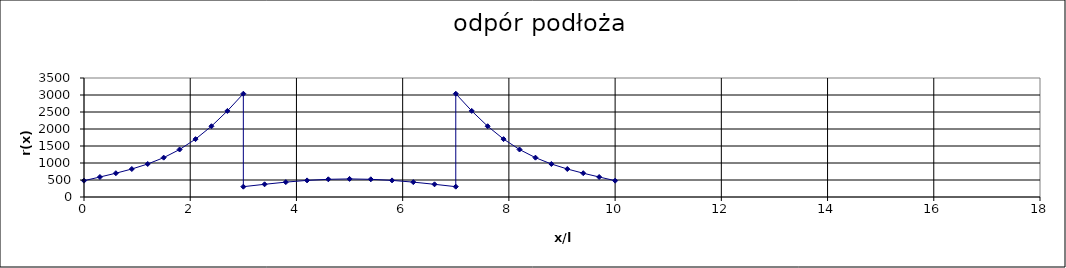
| Category | odpór podłoża |
|---|---|
| 0.0 | 479.947 |
| 0.30000000000000004 | 587.976 |
| 0.6000000000000001 | 699.587 |
| 0.9000000000000001 | 823.132 |
| 1.2000000000000002 | 970.832 |
| 1.5 | 1157.147 |
| 1.8000000000000003 | 1396.831 |
| 2.1 | 1702.487 |
| 2.4000000000000004 | 2081.434 |
| 2.7 | 2531.725 |
| 3.0 | 3037.245 |
| 3.0 | 303.724 |
| 3.4 | 373.601 |
| 3.8 | 437.575 |
| 4.2 | 488.28 |
| 4.6 | 520.662 |
| 5.0 | 531.779 |
| 5.4 | 520.662 |
| 5.800000000000001 | 488.28 |
| 6.2 | 437.575 |
| 6.6 | 373.601 |
| 7.0 | 303.724 |
| 7.0 | 3037.245 |
| 7.3 | 2531.725 |
| 7.6 | 2081.434 |
| 7.9 | 1702.487 |
| 8.2 | 1396.831 |
| 8.5 | 1157.147 |
| 8.8 | 970.832 |
| 9.100000000000001 | 823.132 |
| 9.4 | 699.587 |
| 9.7 | 587.976 |
| 10.0 | 479.947 |